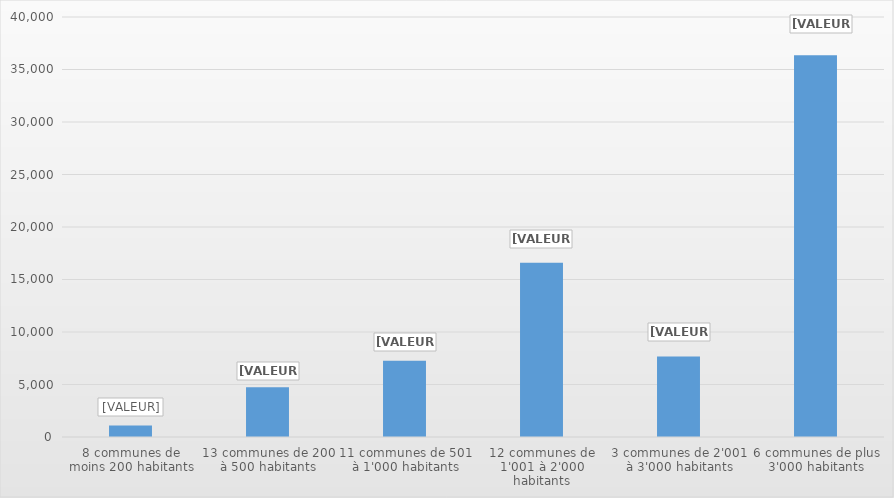
| Category | Series 0 |
|---|---|
| 8 communes de moins 200 habitants | 1090 |
| 13 communes de 200 à 500 habitants | 4745 |
| 11 communes de 501 à 1'000 habitants | 7260 |
| 12 communes de 1'001 à 2'000 habitants | 16602 |
| 3 communes de 2'001 à 3'000 habitants | 7659 |
| 6 communes de plus 3'000 habitants | 36353 |